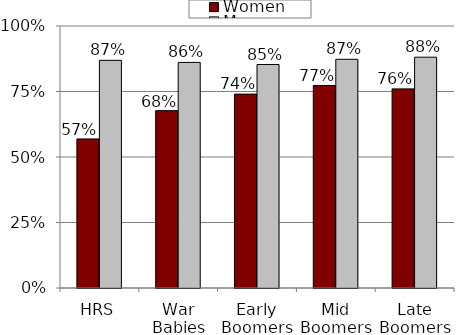
| Category | Women | Men |
|---|---|---|
| HRS | 0.569 | 0.869 |
| War Babies | 0.677 | 0.861 |
| Early Boomers | 0.74 | 0.853 |
| Mid Boomers | 0.773 | 0.873 |
| Late Boomers | 0.76 | 0.881 |